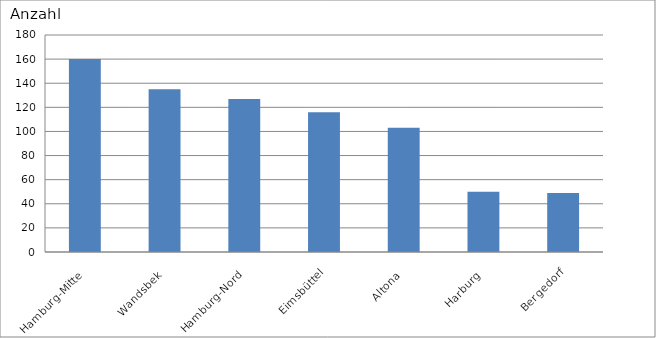
| Category | Hamburg-Mitte |
|---|---|
| Hamburg-Mitte | 160 |
| Wandsbek | 135 |
| Hamburg-Nord | 127 |
| Eimsbüttel | 116 |
| Altona | 103 |
| Harburg | 50 |
| Bergedorf | 49 |